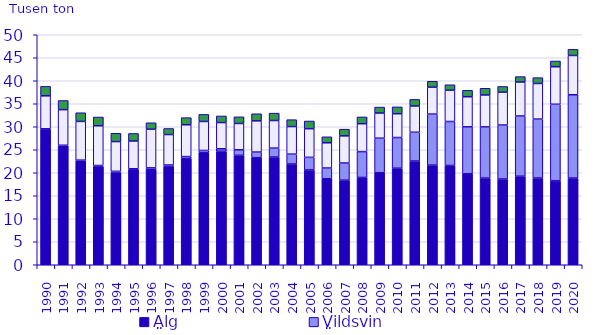
| Category | Älg | Vildsvin | Övriga hjortdjur | Övrigt vilt |
|---|---|---|---|---|
| 1990.0 | 29.516 | 0.038 | 7.172 | 2.058 |
| 1991.0 | 25.913 | 0.066 | 7.734 | 1.995 |
| 1992.0 | 22.67 | 0.073 | 8.416 | 1.885 |
| 1993.0 | 21.398 | 0.178 | 8.637 | 1.903 |
| 1994.0 | 20.117 | 0.187 | 6.471 | 1.808 |
| 1995.0 | 20.688 | 0.173 | 6.051 | 1.637 |
| 1996.0 | 20.644 | 0.419 | 8.402 | 1.405 |
| 1997.0 | 21.34 | 0.347 | 6.62 | 1.314 |
| 1998.0 | 23.061 | 0.451 | 6.923 | 1.547 |
| 1999.0 | 24.364 | 0.477 | 6.306 | 1.536 |
| 2000.0 | 24.676 | 0.539 | 5.693 | 1.438 |
| 2001.0 | 23.79 | 1.198 | 5.726 | 1.445 |
| 2002.0 | 23.278 | 1.222 | 6.787 | 1.542 |
| 2003.0 | 23.415 | 1.941 | 6.001 | 1.602 |
| 2004.0 | 21.905 | 2.139 | 5.993 | 1.502 |
| 2005.0 | 20.615 | 2.732 | 6.232 | 1.674 |
| 2006.0 | 18.701 | 2.328 | 5.489 | 1.3 |
| 2007.0 | 18.385 | 3.733 | 5.903 | 1.451 |
| 2008.0 | 18.981 | 5.617 | 6.064 | 1.474 |
| 2009.0 | 20.007 | 7.509 | 5.467 | 1.296 |
| 2010.0 | 20.985 | 6.672 | 5.173 | 1.495 |
| 2011.0 | 22.547 | 6.262 | 5.709 | 1.424 |
| 2012.0 | 21.658 | 11.091 | 5.858 | 1.282 |
| 2013.0 | 21.582 | 9.562 | 6.793 | 1.197 |
| 2014.0 | 19.77 | 10.219 | 6.536 | 1.401 |
| 2015.0 | 18.84 | 11.129 | 6.942 | 1.458 |
| 2016.0 | 18.641 | 11.733 | 7.134 | 1.255 |
| 2017.0 | 19.246 | 13.091 | 7.39 | 1.178 |
| 2018.0 | 18.854 | 12.808 | 7.746 | 1.268 |
| 2019.0 | 18.24 | 16.652 | 8.157 | 1.246 |
| 2020.0 | 18.854 | 18.104 | 8.537 | 1.331 |